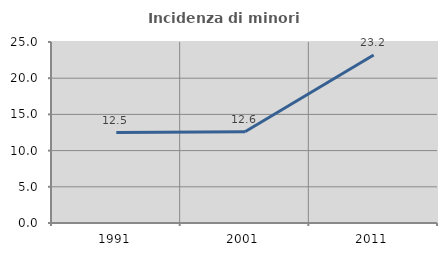
| Category | Incidenza di minori stranieri |
|---|---|
| 1991.0 | 12.5 |
| 2001.0 | 12.605 |
| 2011.0 | 23.207 |